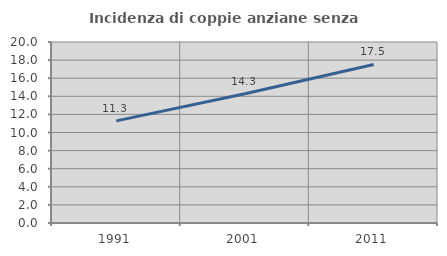
| Category | Incidenza di coppie anziane senza figli  |
|---|---|
| 1991.0 | 11.288 |
| 2001.0 | 14.286 |
| 2011.0 | 17.522 |